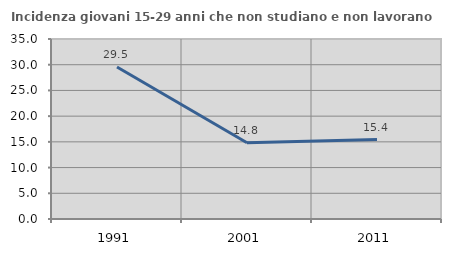
| Category | Incidenza giovani 15-29 anni che non studiano e non lavorano  |
|---|---|
| 1991.0 | 29.545 |
| 2001.0 | 14.815 |
| 2011.0 | 15.436 |